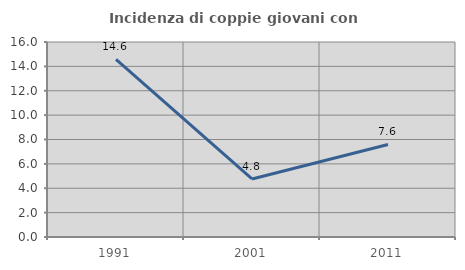
| Category | Incidenza di coppie giovani con figli |
|---|---|
| 1991.0 | 14.583 |
| 2001.0 | 4.762 |
| 2011.0 | 7.595 |